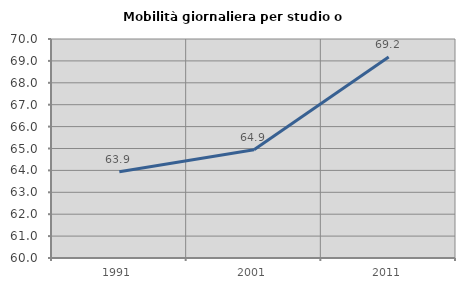
| Category | Mobilità giornaliera per studio o lavoro |
|---|---|
| 1991.0 | 63.941 |
| 2001.0 | 64.941 |
| 2011.0 | 69.18 |